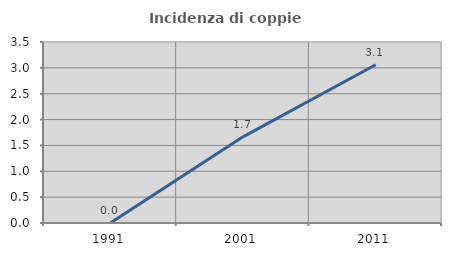
| Category | Incidenza di coppie miste |
|---|---|
| 1991.0 | 0 |
| 2001.0 | 1.667 |
| 2011.0 | 3.059 |